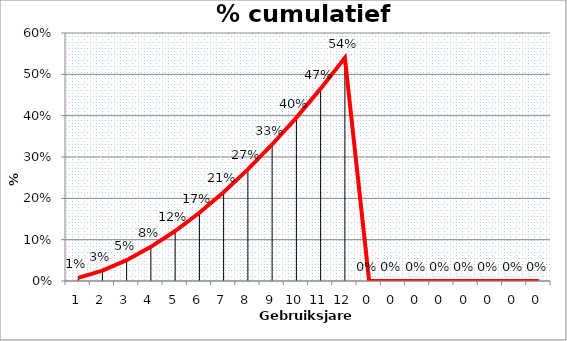
| Category | % onderhoud |
|---|---|
| 0 | 0.008 |
| 1 | 0.025 |
| 2 | 0.05 |
| 3 | 0.083 |
| 4 | 0.121 |
| 5 | 0.165 |
| 6 | 0.215 |
| 7 | 0.27 |
| 8 | 0.33 |
| 9 | 0.395 |
| 10 | 0.465 |
| 11 | 0.54 |
| 12 | 0 |
| 13 | 0 |
| 14 | 0 |
| 15 | 0 |
| 16 | 0 |
| 17 | 0 |
| 18 | 0 |
| 19 | 0 |